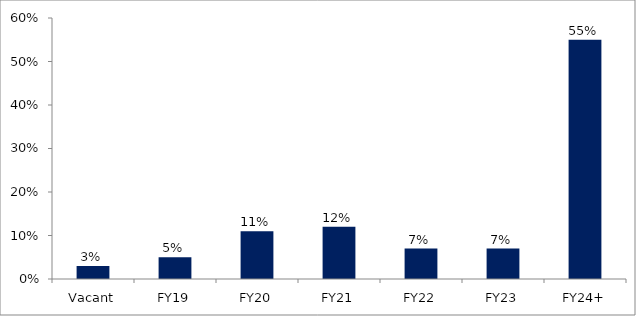
| Category | Series 0 |
|---|---|
| Vacant | 0.03 |
| FY19 | 0.05 |
| FY20 | 0.11 |
| FY21 | 0.12 |
| FY22 | 0.07 |
| FY23 | 0.07 |
| FY24+ | 0.55 |